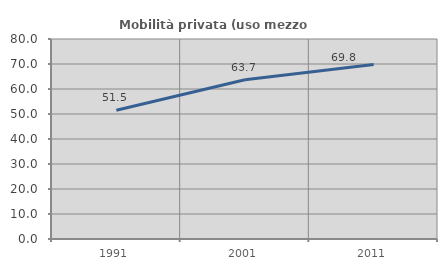
| Category | Mobilità privata (uso mezzo privato) |
|---|---|
| 1991.0 | 51.489 |
| 2001.0 | 63.727 |
| 2011.0 | 69.793 |